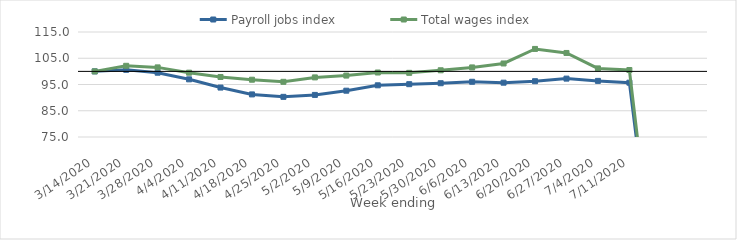
| Category | Payroll jobs index | Total wages index |
|---|---|---|
| 14/03/2020 | 100 | 100 |
| 21/03/2020 | 100.594 | 102.122 |
| 28/03/2020 | 99.492 | 101.52 |
| 04/04/2020 | 96.968 | 99.502 |
| 11/04/2020 | 93.833 | 97.858 |
| 18/04/2020 | 91.226 | 96.823 |
| 25/04/2020 | 90.292 | 96.019 |
| 02/05/2020 | 91.035 | 97.705 |
| 09/05/2020 | 92.64 | 98.4 |
| 16/05/2020 | 94.695 | 99.57 |
| 23/05/2020 | 95.119 | 99.442 |
| 30/05/2020 | 95.488 | 100.422 |
| 06/06/2020 | 96.038 | 101.507 |
| 13/06/2020 | 95.692 | 103.011 |
| 20/06/2020 | 96.259 | 108.549 |
| 27/06/2020 | 97.241 | 107.013 |
| 04/07/2020 | 96.378 | 101.135 |
| 11/07/2020 | 95.698 | 100.522 |